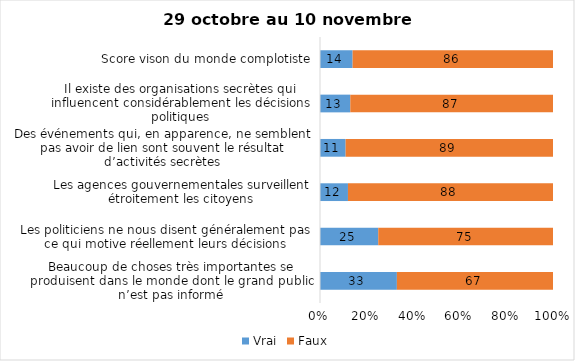
| Category | Vrai | Faux |
|---|---|---|
| Beaucoup de choses très importantes se produisent dans le monde dont le grand public n’est pas informé | 33 | 67 |
| Les politiciens ne nous disent généralement pas ce qui motive réellement leurs décisions | 25 | 75 |
| Les agences gouvernementales surveillent étroitement les citoyens | 12 | 88 |
| Des événements qui, en apparence, ne semblent pas avoir de lien sont souvent le résultat d’activités secrètes | 11 | 89 |
| Il existe des organisations secrètes qui influencent considérablement les décisions politiques | 13 | 87 |
| Score vison du monde complotiste | 14 | 86 |